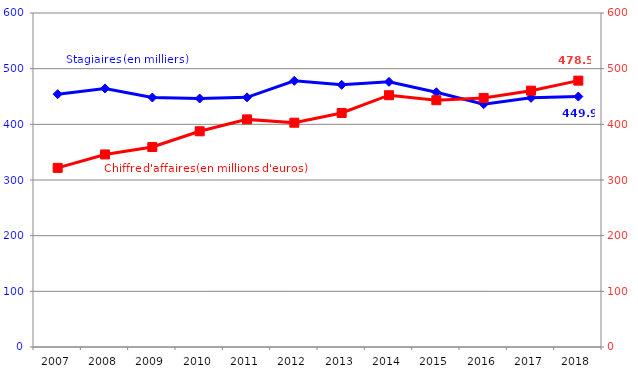
| Category | Stagiaires (en milliers)  |
|---|---|
| 2007.0 | 454.2 |
| 2008.0 | 464.5 |
| 2009.0 | 448.2 |
| 2010.0 | 446.4 |
| 2011.0 | 448.5 |
| 2012.0 | 478.2 |
| 2013.0 | 471 |
| 2014.0 | 476.3 |
| 2015.0 | 457.6 |
| 2016.0 | 436.3 |
| 2017.0 | 447.6 |
| 2018.0 | 449.9 |